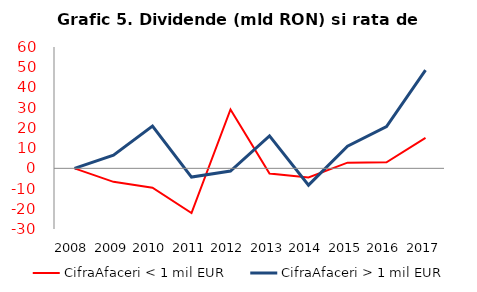
| Category | CifraAfaceri < 1 mil EUR | CifraAfaceri > 1 mil EUR |
|---|---|---|
| 2008.0 | 0 | 0 |
| 2009.0 | -6.677 | 6.515 |
| 2010.0 | -9.557 | 20.878 |
| 2011.0 | -22.086 | -4.324 |
| 2012.0 | 29.131 | -1.332 |
| 2013.0 | -2.57 | 16.036 |
| 2014.0 | -4.494 | -8.322 |
| 2015.0 | 2.793 | 10.969 |
| 2016.0 | 2.994 | 20.657 |
| 2017.0 | 15.051 | 48.588 |